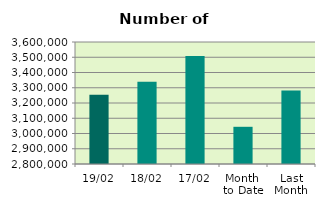
| Category | Series 0 |
|---|---|
| 19/02 | 3254346 |
| 18/02 | 3339522 |
| 17/02 | 3508972 |
| Month 
to Date | 3043937.467 |
| Last
Month | 3281385.4 |